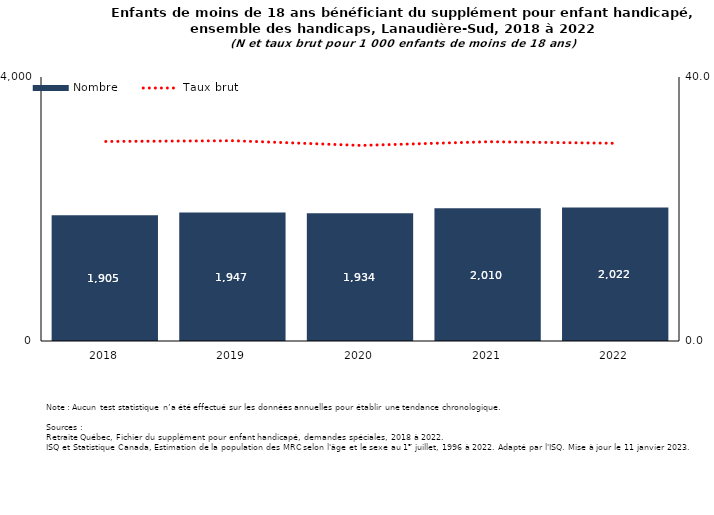
| Category | Nombre |
|---|---|
| 2018.0 | 1905 |
| 2019.0 | 1947 |
| 2020.0 | 1934 |
| 2021.0 | 2010 |
| 2022.0 | 2022 |